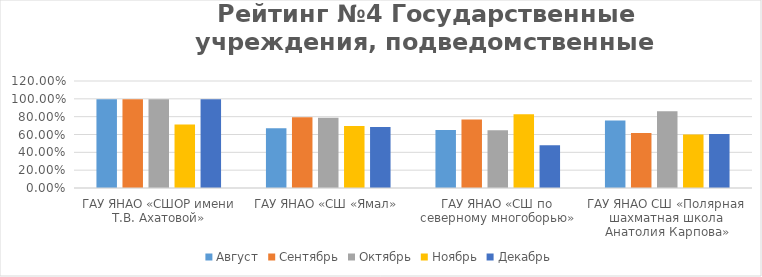
| Category | Август | Сентябрь | Октябрь | Ноябрь | Декабрь |
|---|---|---|---|---|---|
| ГАУ ЯНАО «СШОР имени Т.В. Ахатовой» | 0.995 | 0.995 | 0.994 | 0.712 | 0.994 |
| ГАУ ЯНАО «СШ «Ямал» | 0.671 | 0.793 | 0.787 | 0.695 | 0.684 |
| ГАУ ЯНАО «СШ по северному многоборью» | 0.651 | 0.769 | 0.648 | 0.828 | 0.48 |
| ГАУ ЯНАО СШ «Полярная шахматная школа Анатолия Карпова» | 0.757 | 0.616 | 0.86 | 0.601 | 0.607 |